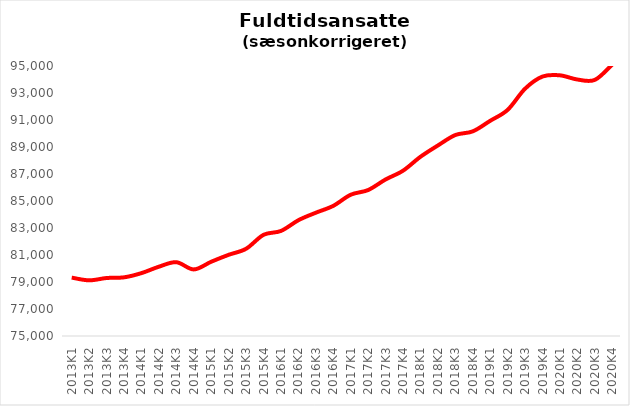
| Category | It-branchen i alt |
|---|---|
| 2013K1 | 79324.487 |
| 2013K2 | 79122.537 |
| 2013K3 | 79295.561 |
| 2013K4 | 79344.939 |
| 2014K1 | 79657.73 |
| 2014K2 | 80133.79 |
| 2014K3 | 80466.297 |
| 2014K4 | 79931.505 |
| 2015K1 | 80501.637 |
| 2015K2 | 81014.271 |
| 2015K3 | 81460.721 |
| 2015K4 | 82493.932 |
| 2016K1 | 82781.679 |
| 2016K2 | 83577.088 |
| 2016K3 | 84133.196 |
| 2016K4 | 84641.245 |
| 2017K1 | 85464.591 |
| 2017K2 | 85813.4 |
| 2017K3 | 86596.491 |
| 2017K4 | 87244.881 |
| 2018K1 | 88276.836 |
| 2018K2 | 89114.141 |
| 2018K3 | 89887.602 |
| 2018K4 | 90158.68 |
| 2019K1 | 90941.702 |
| 2019K2 | 91750.894 |
| 2019K3 | 93320.82 |
| 2019K4 | 94220.042 |
| 2020K1 | 94309.199 |
| 2020K2 | 93998.456 |
| 2020K3 | 93970.964 |
| 2020K4 | 95112.749 |